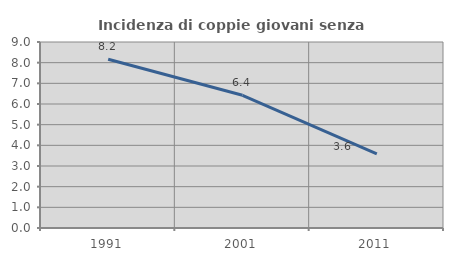
| Category | Incidenza di coppie giovani senza figli |
|---|---|
| 1991.0 | 8.166 |
| 2001.0 | 6.421 |
| 2011.0 | 3.589 |